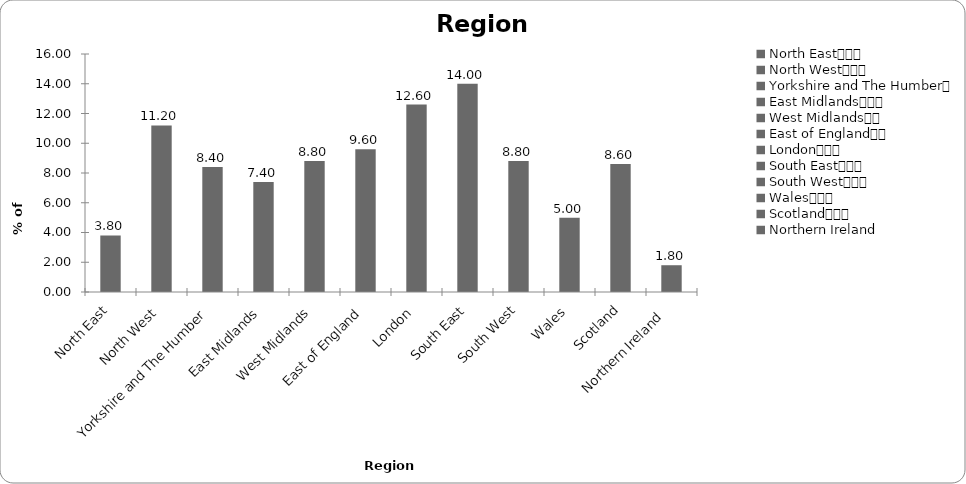
| Category | Region |
|---|---|
| North East			 | 3.8 |
| North West			 | 11.2 |
| Yorkshire and The Humber	 | 8.4 |
| East Midlands			 | 7.4 |
| West Midlands		 | 8.8 |
| East of England		 | 9.6 |
| London			 | 12.6 |
| South East			 | 14 |
| South West			 | 8.8 |
| Wales			 | 5 |
| Scotland			 | 8.6 |
| Northern Ireland  | 1.8 |